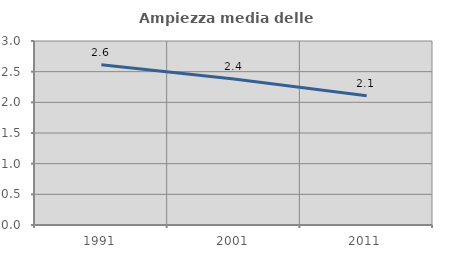
| Category | Ampiezza media delle famiglie |
|---|---|
| 1991.0 | 2.613 |
| 2001.0 | 2.382 |
| 2011.0 | 2.108 |